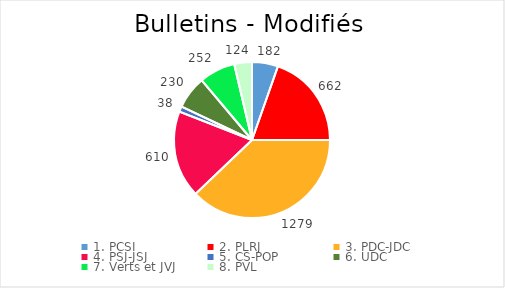
| Category | Series 0 |
|---|---|
| 1. PCSI | 182 |
| 2. PLRJ | 662 |
| 3. PDC-JDC | 1279 |
| 4. PSJ-JSJ | 610 |
| 5. CS-POP | 38 |
| 6. UDC | 230 |
| 7. Verts et JVJ | 252 |
| 8. PVL | 124 |